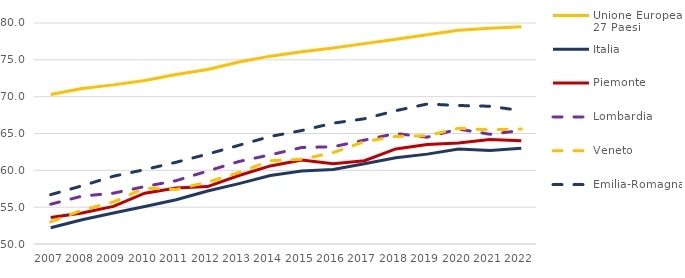
| Category | Unione Europea - 27 Paesi | Italia | Piemonte | Lombardia | Veneto | Emilia-Romagna |
|---|---|---|---|---|---|---|
| 2007 | 70.3 | 52.2 | 53.6 | 55.4 | 53 | 56.7 |
| 2008 | 71.1 | 53.3 | 54.2 | 56.5 | 54.6 | 57.9 |
| 2009 | 71.6 | 54.2 | 55.1 | 56.9 | 55.7 | 59.2 |
| 2010 | 72.2 | 55.1 | 56.9 | 57.8 | 57.6 | 60.1 |
| 2011 | 73 | 56 | 57.6 | 58.6 | 57.4 | 61.1 |
| 2012 | 73.7 | 57.2 | 57.8 | 59.9 | 58.4 | 62.2 |
| 2013 | 74.7 | 58.2 | 59.3 | 61.2 | 59.7 | 63.4 |
| 2014 | 75.5 | 59.3 | 60.6 | 62.1 | 61.3 | 64.6 |
| 2015 | 76.1 | 59.9 | 61.4 | 63.1 | 61.5 | 65.4 |
| 2016 | 76.6 | 60.1 | 60.9 | 63.2 | 62.4 | 66.4 |
| 2017 | 77.2 | 60.9 | 61.3 | 64.1 | 63.9 | 67 |
| 2018 | 77.8 | 61.7 | 62.9 | 65 | 64.6 | 68.1 |
| 2019 | 78.4 | 62.2 | 63.5 | 64.5 | 64.7 | 69 |
| 2020 | 79 | 62.9 | 63.7 | 65.6 | 65.7 | 68.8 |
| 2021 | 79.3 | 62.7 | 64.2 | 64.9 | 65.5 | 68.7 |
| 2022 | 79.5 | 63 | 64 | 65.4 | 65.6 | 68.1 |